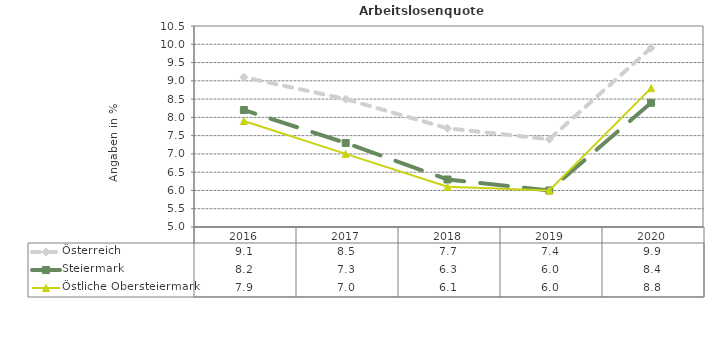
| Category | Österreich | Steiermark | Östliche Obersteiermark |
|---|---|---|---|
| 2020.0 | 9.9 | 8.4 | 8.8 |
| 2019.0 | 7.4 | 6 | 6 |
| 2018.0 | 7.7 | 6.3 | 6.1 |
| 2017.0 | 8.5 | 7.3 | 7 |
| 2016.0 | 9.1 | 8.2 | 7.9 |